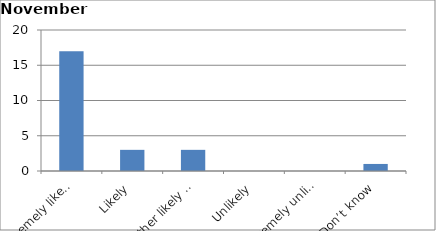
| Category | Series 0 |
|---|---|
| Extremely likely | 17 |
| Likely | 3 |
| Neither likely nor unlikely | 3 |
| Unlikely | 0 |
| Extremely unlikely | 0 |
| Don’t know | 1 |